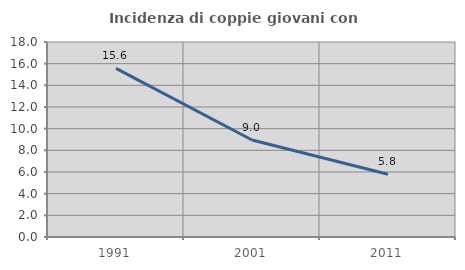
| Category | Incidenza di coppie giovani con figli |
|---|---|
| 1991.0 | 15.57 |
| 2001.0 | 8.955 |
| 2011.0 | 5.789 |